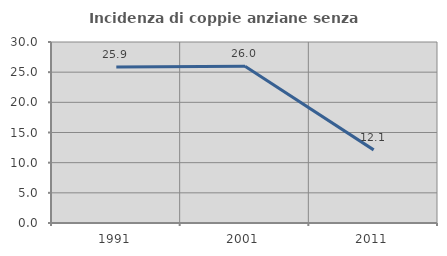
| Category | Incidenza di coppie anziane senza figli  |
|---|---|
| 1991.0 | 25.862 |
| 2001.0 | 26 |
| 2011.0 | 12.121 |